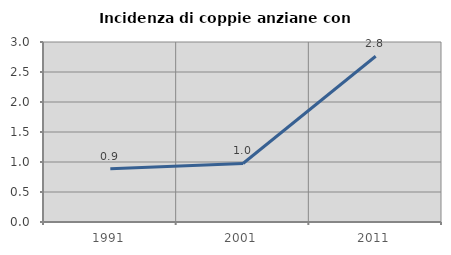
| Category | Incidenza di coppie anziane con figli |
|---|---|
| 1991.0 | 0.889 |
| 2001.0 | 0.976 |
| 2011.0 | 2.762 |